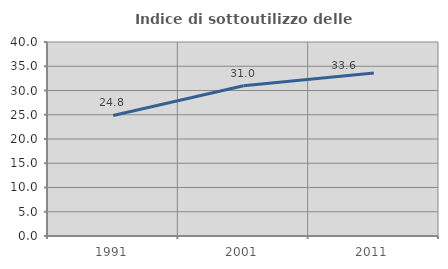
| Category | Indice di sottoutilizzo delle abitazioni  |
|---|---|
| 1991.0 | 24.849 |
| 2001.0 | 30.964 |
| 2011.0 | 33.63 |